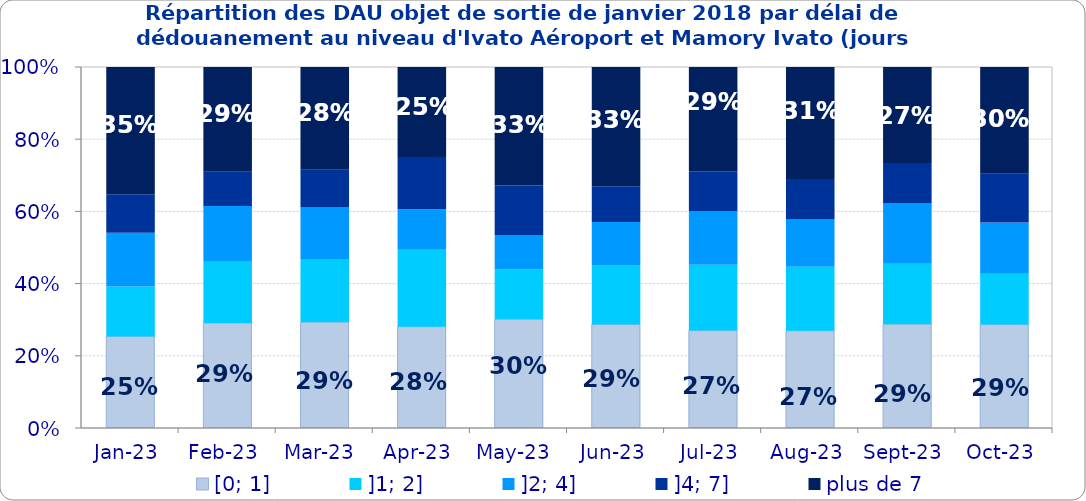
| Category | [0; 1] | ]1; 2] | ]2; 4] | ]4; 7] | plus de 7 |
|---|---|---|---|---|---|
| 2023-01-01 | 0.254 | 0.138 | 0.149 | 0.106 | 0.353 |
| 2023-02-01 | 0.291 | 0.17 | 0.155 | 0.095 | 0.29 |
| 2023-03-01 | 0.293 | 0.175 | 0.143 | 0.104 | 0.284 |
| 2023-04-01 | 0.281 | 0.213 | 0.113 | 0.145 | 0.249 |
| 2023-05-01 | 0.301 | 0.138 | 0.096 | 0.137 | 0.328 |
| 2023-06-01 | 0.287 | 0.165 | 0.119 | 0.099 | 0.33 |
| 2023-07-01 | 0.27 | 0.182 | 0.149 | 0.11 | 0.289 |
| 2023-08-01 | 0.27 | 0.177 | 0.13 | 0.112 | 0.31 |
| 2023-09-01 | 0.288 | 0.167 | 0.167 | 0.112 | 0.266 |
| 2023-10-01 | 0.287 | 0.141 | 0.142 | 0.135 | 0.296 |